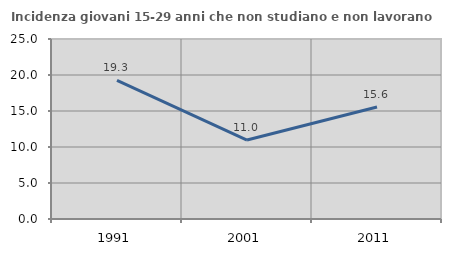
| Category | Incidenza giovani 15-29 anni che non studiano e non lavorano  |
|---|---|
| 1991.0 | 19.252 |
| 2001.0 | 10.963 |
| 2011.0 | 15.553 |